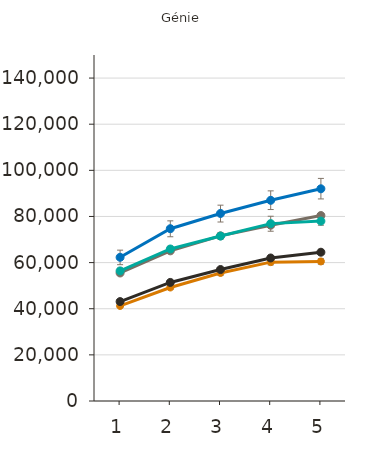
| Category | Certificat d'études collégial | Diplôme d'études collégial | Baccalauréat | Maîtrise | Doctorat | Grade professionnel |
|---|---|---|---|---|---|---|
| 1.0 | 41200 | 43100 | 55500 | 56400 | 62300 |  |
| 2.0 | 49200 | 51400 | 65100 | 65900 | 74700 |  |
| 3.0 | 55500 | 57000 | 71600 | 71500 | 81300 |  |
| 4.0 | 60200 | 62000 | 76200 | 76900 | 87000 |  |
| 5.0 | 60500 | 64500 | 80400 | 78000 | 92000 |  |